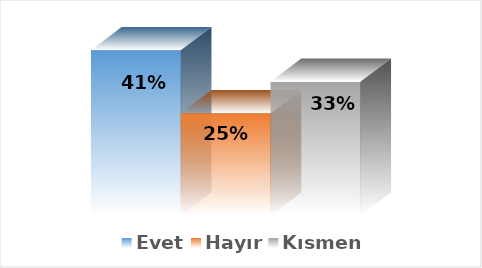
| Category | Evet | Hayır | Kısmen |
|---|---|---|---|
| 0 | 0.412 | 0.255 | 0.333 |